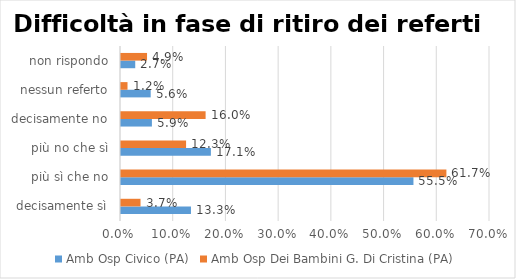
| Category | Amb Osp Civico (PA) | Amb Osp Dei Bambini G. Di Cristina (PA) |
|---|---|---|
| decisamente sì | 0.133 | 0.037 |
| più sì che no | 0.555 | 0.617 |
| più no che sì | 0.171 | 0.123 |
| decisamente no | 0.059 | 0.16 |
| nessun referto | 0.056 | 0.012 |
| non rispondo | 0.027 | 0.049 |